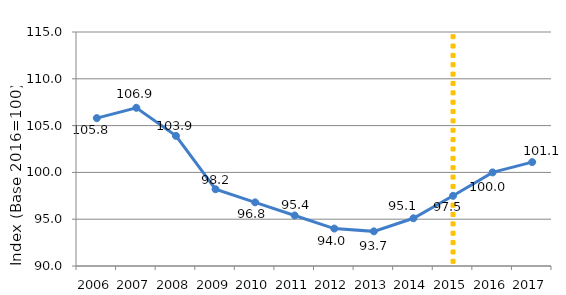
| Category | Series 39 | Series 38 | Series 1 | Series 2 | Series 3 | Series 30 | Series 4 | Series 29 | Series 31 | Series 32 | Series 33 | Series 34 | Series 35 | Series 36 | Series 37 | Series 40 | Series 41 | Series 42 | Series 43 | Series 44 | Series 45 | Series 46 | Series 47 | Series 48 | Series 49 | Series 50 | Series 51 | Series 52 | Series 53 | Series 0 |
|---|---|---|---|---|---|---|---|---|---|---|---|---|---|---|---|---|---|---|---|---|---|---|---|---|---|---|---|---|---|---|
| 2006.0 |  |  |  |  |  |  |  |  |  |  |  |  |  |  |  |  |  |  |  |  |  |  |  |  |  |  |  |  |  | 105.8 |
| 2007.0 |  |  |  |  |  |  |  |  |  |  |  |  |  |  |  |  |  |  |  |  |  |  |  |  |  |  |  |  |  | 106.9 |
| 2008.0 |  |  |  |  |  |  |  |  |  |  |  |  |  |  |  |  |  |  |  |  |  |  |  |  |  |  |  |  |  | 103.9 |
| 2009.0 |  |  |  |  |  |  |  |  |  |  |  |  |  |  |  |  |  |  |  |  |  |  |  |  |  |  |  |  |  | 98.2 |
| 2010.0 |  |  |  |  |  |  |  |  |  |  |  |  |  |  |  |  |  |  |  |  |  |  |  |  |  |  |  |  |  | 96.8 |
| 2011.0 |  |  |  |  |  |  |  |  |  |  |  |  |  |  |  |  |  |  |  |  |  |  |  |  |  |  |  |  |  | 95.4 |
| 2012.0 |  |  |  |  |  |  |  |  |  |  |  |  |  |  |  |  |  |  |  |  |  |  |  |  |  |  |  |  |  | 94 |
| 2013.0 |  |  |  |  |  |  |  |  |  |  |  |  |  |  |  |  |  |  |  |  |  |  |  |  |  |  |  |  |  | 93.7 |
| 2014.0 |  |  |  |  |  |  |  |  |  |  |  |  |  |  |  |  |  |  |  |  |  |  |  |  |  |  |  |  |  | 95.1 |
| 2015.0 |  |  |  |  |  |  |  |  |  |  |  |  |  |  |  |  |  |  |  |  |  |  |  |  |  |  |  |  |  | 97.5 |
| 2016.0 |  |  |  |  |  |  |  |  |  |  |  |  |  |  |  |  |  |  |  |  |  |  |  |  |  |  |  |  |  | 100 |
| 2017.0 |  |  |  |  |  |  |  |  |  |  |  |  |  |  |  |  |  |  |  |  |  |  |  |  |  |  |  |  |  | 101.1 |